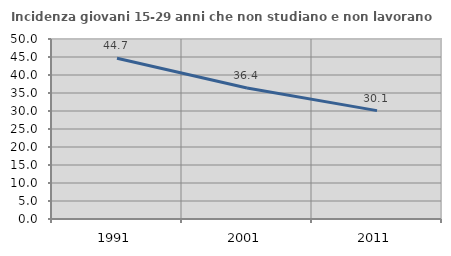
| Category | Incidenza giovani 15-29 anni che non studiano e non lavorano  |
|---|---|
| 1991.0 | 44.662 |
| 2001.0 | 36.381 |
| 2011.0 | 30.102 |